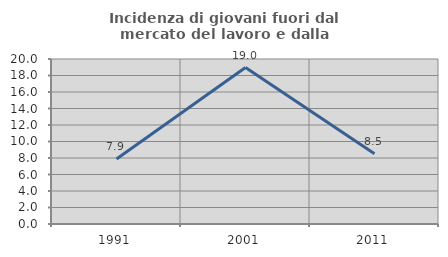
| Category | Incidenza di giovani fuori dal mercato del lavoro e dalla formazione  |
|---|---|
| 1991.0 | 7.868 |
| 2001.0 | 18.966 |
| 2011.0 | 8.511 |